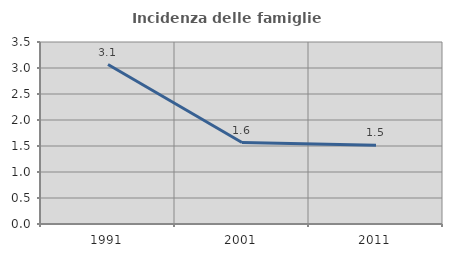
| Category | Incidenza delle famiglie numerose |
|---|---|
| 1991.0 | 3.067 |
| 2001.0 | 1.566 |
| 2011.0 | 1.516 |